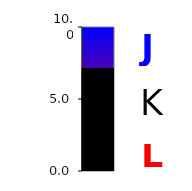
| Category | Series 0 |
|---|---|
| 0 | 7.122 |